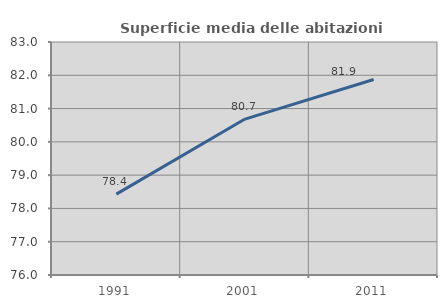
| Category | Superficie media delle abitazioni occupate |
|---|---|
| 1991.0 | 78.429 |
| 2001.0 | 80.685 |
| 2011.0 | 81.874 |